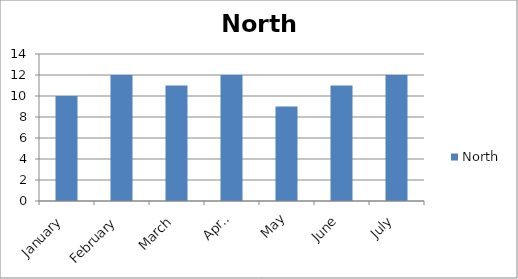
| Category | North |
|---|---|
| January | 10 |
| February | 12 |
| March | 11 |
| April | 12 |
| May | 9 |
| June | 11 |
| July | 12 |